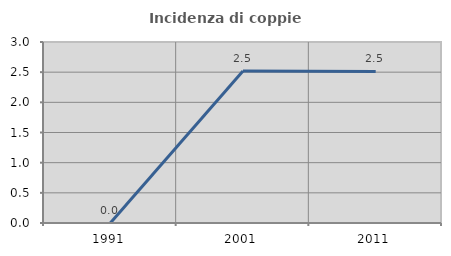
| Category | Incidenza di coppie miste |
|---|---|
| 1991.0 | 0 |
| 2001.0 | 2.518 |
| 2011.0 | 2.513 |